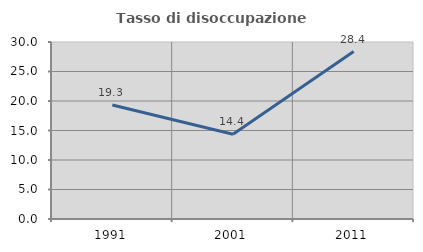
| Category | Tasso di disoccupazione giovanile  |
|---|---|
| 1991.0 | 19.317 |
| 2001.0 | 14.355 |
| 2011.0 | 28.378 |